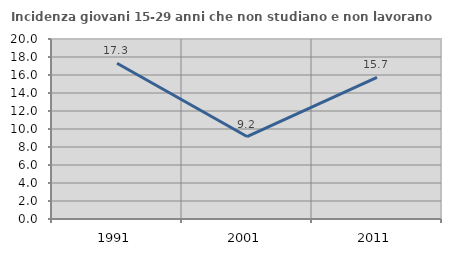
| Category | Incidenza giovani 15-29 anni che non studiano e non lavorano  |
|---|---|
| 1991.0 | 17.304 |
| 2001.0 | 9.162 |
| 2011.0 | 15.741 |